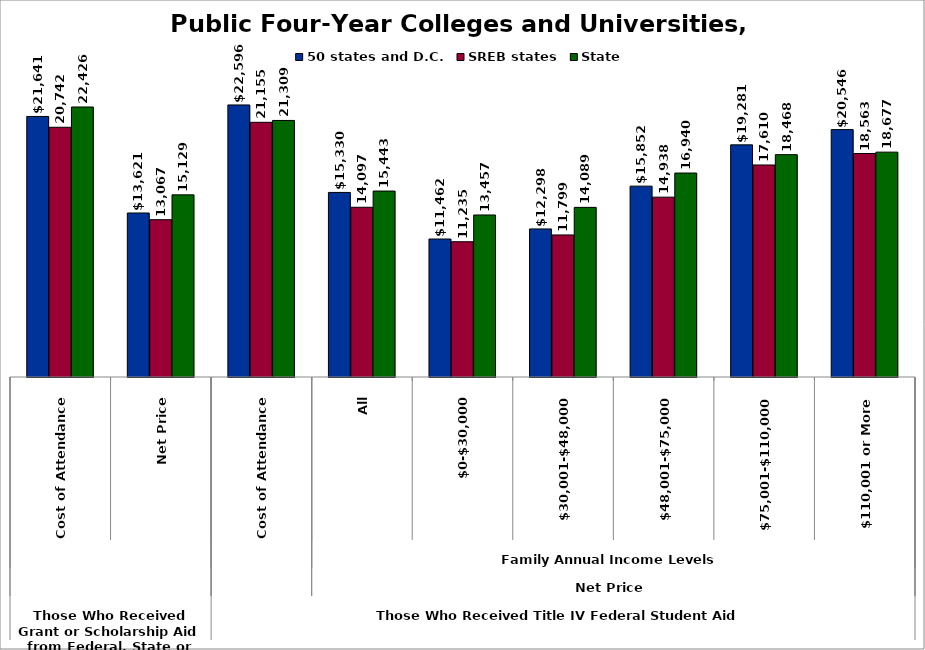
| Category | 50 states and D.C. | SREB states | State |
|---|---|---|---|
| 0 | 21641.305 | 20741.5 | 22425.975 |
| 1 | 13621.299 | 13066.852 | 15128.712 |
| 2 | 22596.09 | 21154.558 | 21308.951 |
| 3 | 15329.592 | 14096.731 | 15443.364 |
| 4 | 11461.609 | 11235.183 | 13457.222 |
| 5 | 12297.95 | 11799.085 | 14089.362 |
| 6 | 15852.451 | 14937.617 | 16940.012 |
| 7 | 19280.801 | 17610.132 | 18467.674 |
| 8 | 20546.421 | 18562.829 | 18676.718 |